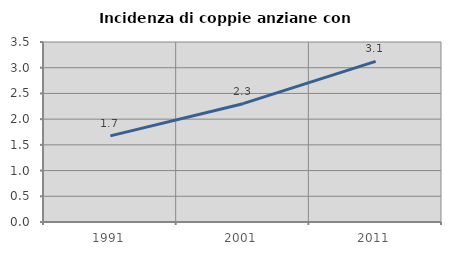
| Category | Incidenza di coppie anziane con figli |
|---|---|
| 1991.0 | 1.675 |
| 2001.0 | 2.301 |
| 2011.0 | 3.122 |